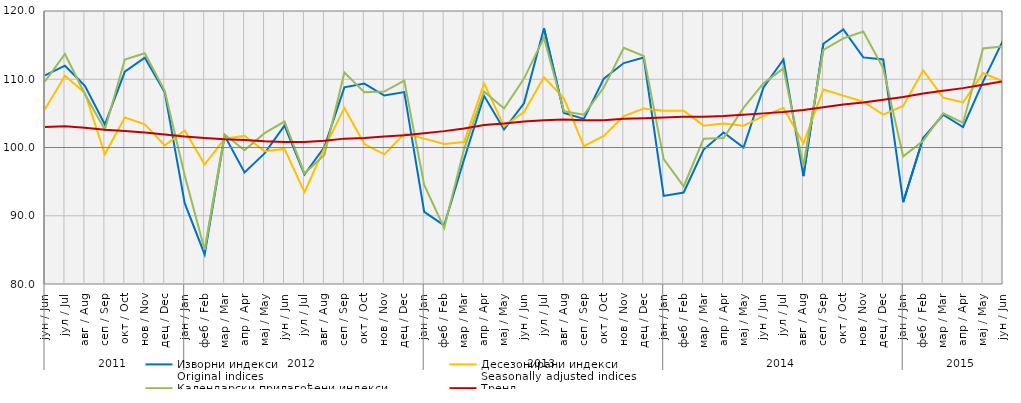
| Category | Изворни индекси
Original indices | Десезонирани индекси
Seasonally adjusted indices | Календарски прилагођени индекси
Working-day adjusted indices | Тренд
Trend |
|---|---|---|---|---|
| 0 | 110.572 | 105.6 | 109.7 | 103 |
| 1 | 111.982 | 110.5 | 113.7 | 103.1 |
| 2 | 109.048 | 108 | 107.8 | 102.9 |
| 3 | 103.369 | 99 | 102.6 | 102.6 |
| 4 | 111.125 | 104.4 | 112.9 | 102.4 |
| 5 | 113.167 | 103.4 | 113.8 | 102.2 |
| 6 | 108.083 | 100.3 | 108.3 | 101.9 |
| 7 | 91.849 | 102.5 | 95.9 | 101.6 |
| 8 | 84.325 | 97.5 | 85 | 101.4 |
| 9 | 101.706 | 101.3 | 101.9 | 101.2 |
| 10 | 96.339 | 101.7 | 99.6 | 101.1 |
| 11 | 99.133 | 99.46 | 102.1 | 100.9 |
| 12 | 103.214 | 99.79 | 103.8 | 100.8 |
| 13 | 96.046 | 93.46 | 96.2 | 100.8 |
| 14 | 100.071 | 99.9 | 98.9 | 101 |
| 15 | 108.809 | 105.8 | 111 | 101.3 |
| 16 | 109.371 | 100.5 | 108.1 | 101.4 |
| 17 | 107.609 | 99 | 108.2 | 101.6 |
| 18 | 108.112 | 102 | 109.8 | 101.8 |
| 19 | 90.559 | 101.3 | 94.5 | 102.1 |
| 20 | 88.596 | 100.5 | 88.2 | 102.4 |
| 21 | 98.288 | 100.8 | 99.8 | 102.8 |
| 22 | 107.567 | 109.4 | 108.2 | 103.3 |
| 23 | 102.635 | 103.1 | 105.7 | 103.5 |
| 24 | 106.478 | 105.2 | 110.1 | 103.8 |
| 25 | 117.488 | 110.3 | 116.1 | 104 |
| 26 | 105.073 | 107.2 | 105.3 | 104.1 |
| 27 | 104.198 | 100.2 | 104.8 | 104 |
| 28 | 110.096 | 101.7 | 108.8 | 104 |
| 29 | 112.368 | 104.6 | 114.6 | 104.2 |
| 30 | 113.169 | 105.7 | 113.4 | 104.3 |
| 31 | 92.9 | 105.4 | 98.3 | 104.4 |
| 32 | 93.4 | 105.4 | 94.3 | 104.5 |
| 33 | 99.7 | 103.2 | 101.3 | 104.5 |
| 34 | 102.2 | 103.5 | 101.4 | 104.6 |
| 35 | 100 | 103.2 | 105.8 | 104.8 |
| 36 | 108.8 | 104.6 | 109.4 | 105 |
| 37 | 112.9 | 105.8 | 111.6 | 105.2 |
| 38 | 95.8 | 100.6 | 97.3 | 105.5 |
| 39 | 115.2 | 108.5 | 114.3 | 105.9 |
| 40 | 117.3 | 107.6 | 116 | 106.3 |
| 41 | 113.2 | 106.7 | 117 | 106.6 |
| 42 | 112.9 | 104.8 | 111.6 | 107 |
| 43 | 92 | 106.1 | 98.7 | 107.4 |
| 44 | 101.4 | 111.3 | 101 | 107.9 |
| 45 | 104.8 | 107.3 | 105 | 108.3 |
| 46 | 103 | 106.6 | 103.6 | 108.7 |
| 47 | 109.651 | 110.9 | 114.5 | 109.2 |
| 48 | 115.698 | 109.7 | 114.8 | 109.7 |